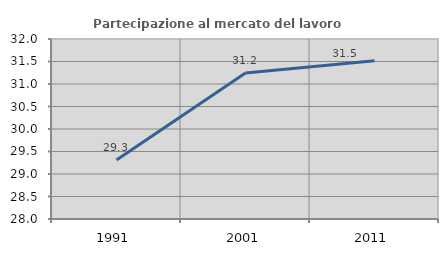
| Category | Partecipazione al mercato del lavoro  femminile |
|---|---|
| 1991.0 | 29.31 |
| 2001.0 | 31.246 |
| 2011.0 | 31.515 |